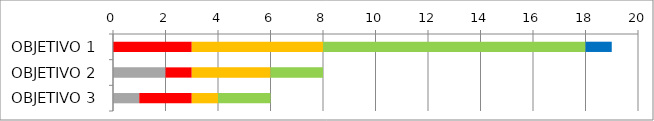
| Category | Series 1 | Series 2 | Series 3 | Series 4 | Series 5 |
|---|---|---|---|---|---|
| OBJETIVO 1 | 0 | 3 | 5 | 10 | 1 |
| OBJETIVO 2 | 2 | 1 | 3 | 2 | 0 |
| OBJETIVO 3 | 1 | 2 | 1 | 2 | 0 |